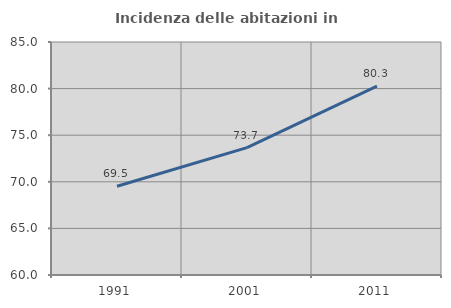
| Category | Incidenza delle abitazioni in proprietà  |
|---|---|
| 1991.0 | 69.517 |
| 2001.0 | 73.673 |
| 2011.0 | 80.26 |